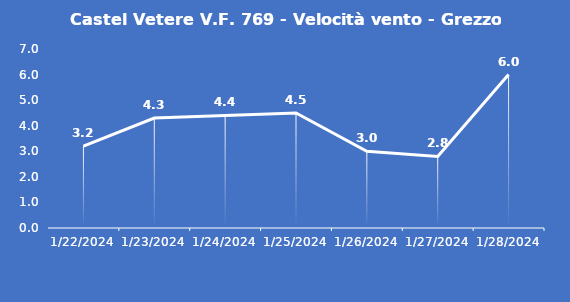
| Category | Castel Vetere V.F. 769 - Velocità vento - Grezzo (m/s) |
|---|---|
| 1/22/24 | 3.2 |
| 1/23/24 | 4.3 |
| 1/24/24 | 4.4 |
| 1/25/24 | 4.5 |
| 1/26/24 | 3 |
| 1/27/24 | 2.8 |
| 1/28/24 | 6 |